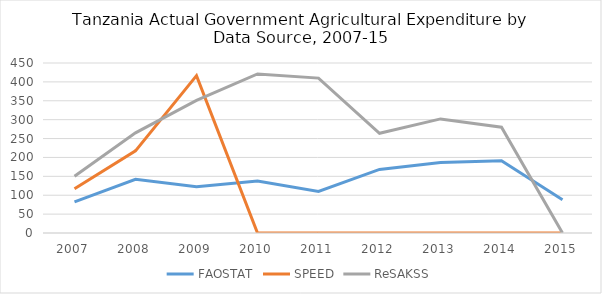
| Category | FAOSTAT | SPEED | ReSAKSS |
|---|---|---|---|
| 2007.0 | 82.63 | 116.866 | 150 |
| 2008.0 | 142.34 | 217.403 | 265 |
| 2009.0 | 122.36 | 416.477 | 351 |
| 2010.0 | 137.65 | 0 | 421 |
| 2011.0 | 109.88 | 0 | 410 |
| 2012.0 | 168.22 | 0 | 264 |
| 2013.0 | 186.71 | 0 | 302 |
| 2014.0 | 191.13 | 0 | 280 |
| 2015.0 | 87.94 | 0 | 0 |